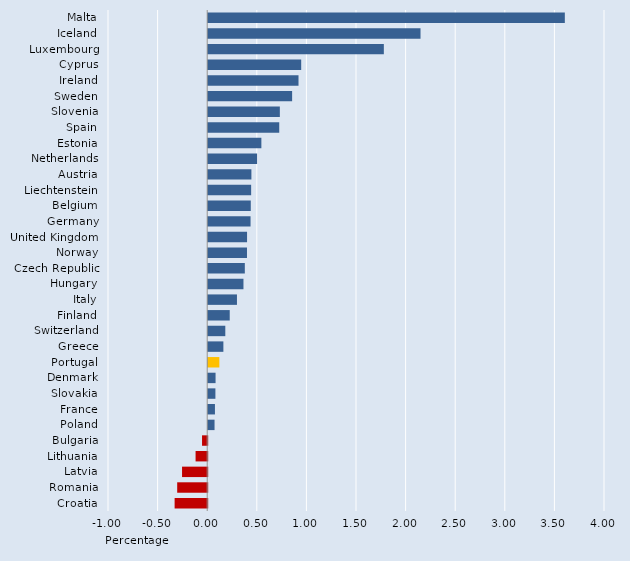
| Category | Series 0 |
|---|---|
| Malta | 3.595 |
| Iceland | 2.14 |
| Luxembourg | 1.771 |
| Cyprus | 0.937 |
| Ireland | 0.91 |
| Sweden | 0.846 |
| Slovenia | 0.722 |
| Spain | 0.716 |
| Estonia | 0.536 |
| Netherlands | 0.493 |
| Austria | 0.436 |
| Liechtenstein | 0.433 |
| Belgium | 0.429 |
| Germany | 0.427 |
| United Kingdom | 0.392 |
| Norway | 0.391 |
| Czech Republic | 0.369 |
| Hungary | 0.355 |
| Italy | 0.29 |
| Finland | 0.217 |
| Switzerland | 0.172 |
| Greece | 0.153 |
| Portugal | 0.112 |
| Denmark | 0.074 |
| Slovakia | 0.073 |
| France | 0.068 |
| Poland | 0.064 |
| Bulgaria | -0.052 |
| Lithuania | -0.117 |
| Latvia | -0.254 |
| Romania | -0.303 |
| Croatia | -0.328 |